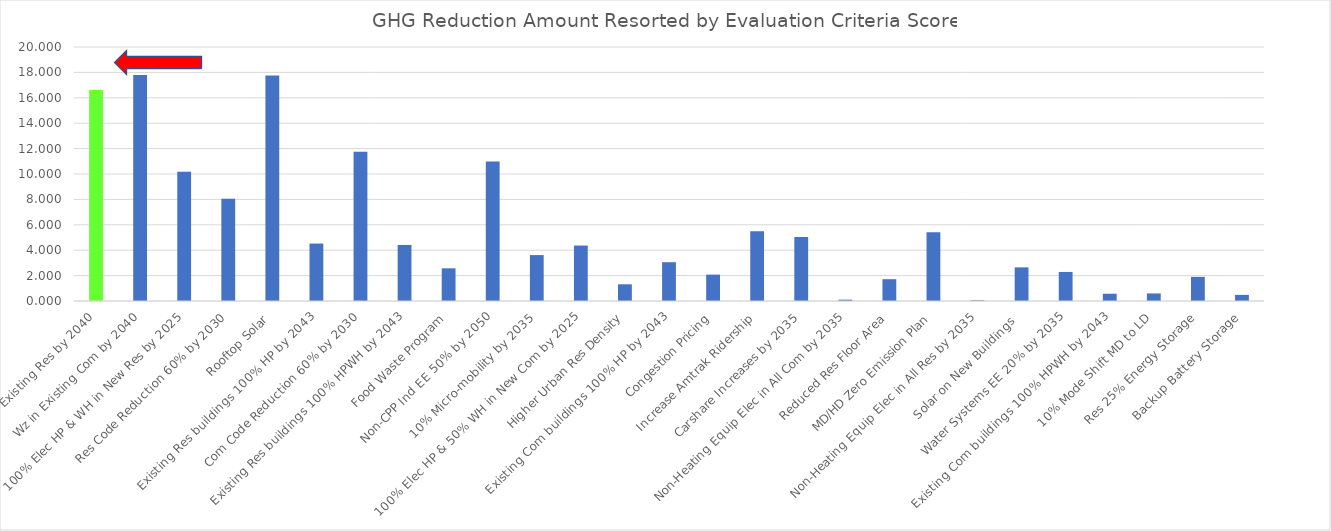
| Category | Series 0 |
|---|---|
| Wz in Existing Res by 2040 | 16.61 |
| Wz in Existing Com by 2040 | 17.791 |
| 100% Elec HP & WH in New Res by 2025 | 10.182 |
| Res Code Reduction 60% by 2030 | 8.044 |
| Rooftop Solar | 17.757 |
| Existing Res buildings 100% HP by 2043 | 4.523 |
| Com Code Reduction 60% by 2030 | 11.751 |
| Existing Res buildings 100% HPWH by 2043 | 4.414 |
| Food Waste Program | 2.572 |
| Non-CPP Ind EE 50% by 2050 | 10.987 |
| 10% Micro-mobility by 2035 | 3.615 |
| 100% Elec HP & 50% WH in New Com by 2025 | 4.366 |
| Higher Urban Res Density | 1.315 |
| Existing Com buildings 100% HP by 2043 | 3.055 |
| Congestion Pricing | 2.078 |
| Increase Amtrak Ridership | 5.497 |
| Carshare Increases by 2035 | 5.042 |
| Non-Heating Equip Elec in All Com by 2035 | 0.103 |
| Reduced Res Floor Area | 1.718 |
| MD/HD Zero Emission Plan | 5.419 |
| Non-Heating Equip Elec in All Res by 2035 | 0.055 |
| Solar on New Buildings  | 2.648 |
| Water Systems EE 20% by 2035 | 2.286 |
| Existing Com buildings 100% HPWH by 2043 | 0.572 |
| 10% Mode Shift MD to LD | 0.595 |
| Res 25% Energy Storage | 1.9 |
| Backup Battery Storage | 0.482 |